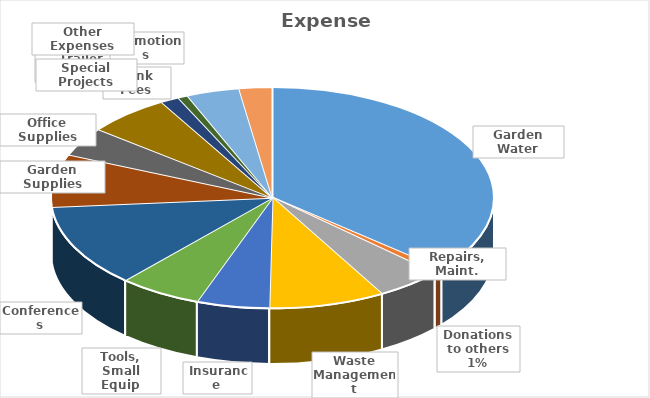
| Category | Series 0 |
|---|---|
| Garden Water | 0.362 |
| Donations to others | 0.007 |
| Repairs, Maint. | 0.048 |
| Waste Management | 0.085 |
|  Insurance | 0.053 |
| Tools, Small Equip | 0.06 |
| Conferences | 0.121 |
| Garden Supplies | 0.077 |
| Office Supplies | 0.042 |
| Trailer Utilities | 0.06 |
| Bank Fees | 0.014 |
| Promotions | 0.007 |
| Special Projects | 0.039 |
| Other Expenses | 0.024 |